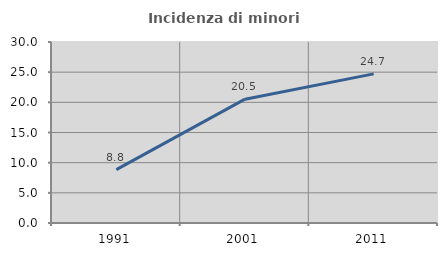
| Category | Incidenza di minori stranieri |
|---|---|
| 1991.0 | 8.846 |
| 2001.0 | 20.522 |
| 2011.0 | 24.719 |